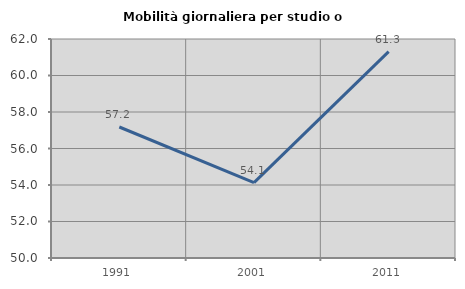
| Category | Mobilità giornaliera per studio o lavoro |
|---|---|
| 1991.0 | 57.178 |
| 2001.0 | 54.129 |
| 2011.0 | 61.304 |